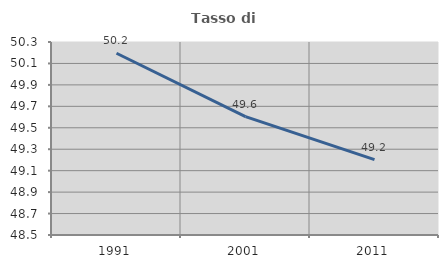
| Category | Tasso di occupazione   |
|---|---|
| 1991.0 | 50.195 |
| 2001.0 | 49.604 |
| 2011.0 | 49.203 |